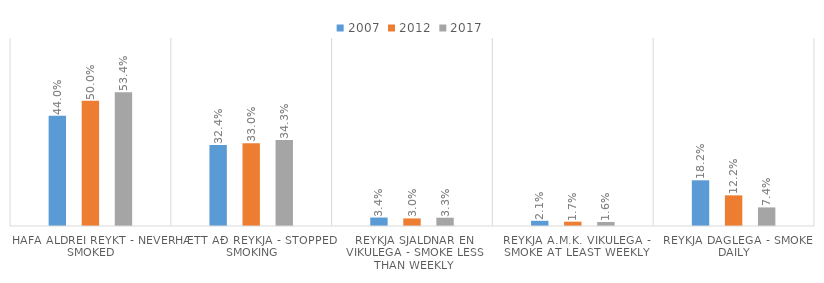
| Category | 2007 | 2012 | 2017 |
|---|---|---|---|
| Hafa aldrei reykt - Never smoked | 0.44 | 0.5 | 0.534 |
| Hætt að reykja - Stopped smoking | 0.324 | 0.33 | 0.343 |
| Reykja sjaldnar en vikulega - Smoke less than weekly | 0.034 | 0.03 | 0.033 |
| Reykja a.m.k. vikulega - Smoke at least weekly | 0.021 | 0.017 | 0.016 |
| Reykja daglega - Smoke daily | 0.182 | 0.122 | 0.074 |